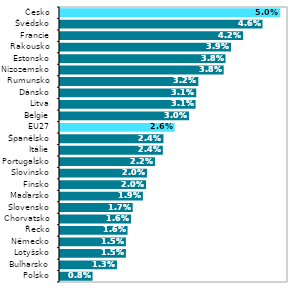
| Category |  2020* |
|---|---|
| Polsko | 0.008 |
| Bulharsko | 0.013 |
| Lotyšsko | 0.015 |
| Německo | 0.015 |
| Řecko | 0.016 |
| Chorvatsko | 0.016 |
| Slovensko | 0.017 |
| Maďarsko | 0.019 |
| Finsko | 0.02 |
| Slovinsko | 0.02 |
| Portugalsko | 0.022 |
| Itálie | 0.024 |
| Španělsko | 0.024 |
| EU27 | 0.026 |
| Belgie | 0.03 |
| Litva | 0.031 |
| Dánsko | 0.031 |
| Rumunsko | 0.032 |
| Nizozemsko | 0.038 |
| Estonsko | 0.038 |
| Rakousko | 0.039 |
| Francie | 0.042 |
| Švédsko | 0.046 |
| Česko | 0.05 |